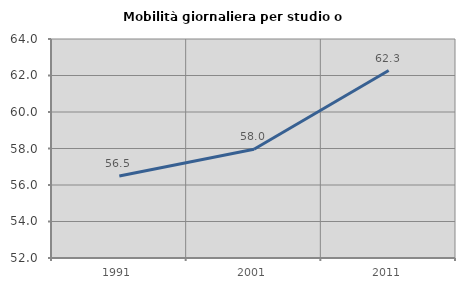
| Category | Mobilità giornaliera per studio o lavoro |
|---|---|
| 1991.0 | 56.488 |
| 2001.0 | 57.96 |
| 2011.0 | 62.271 |